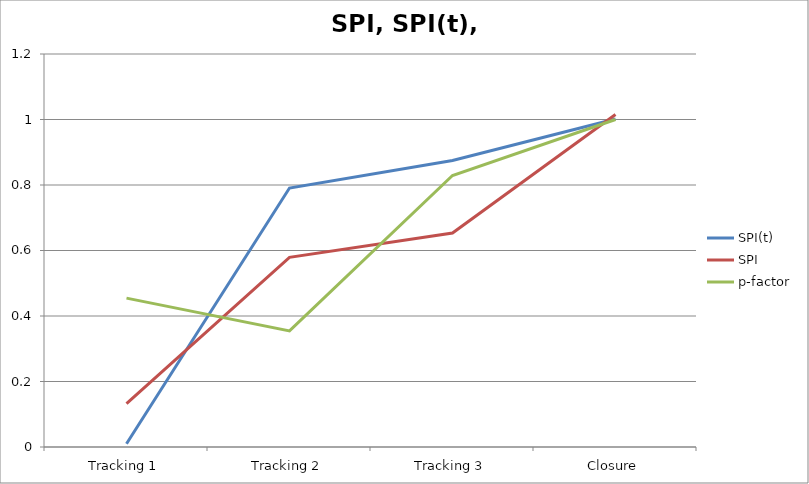
| Category | SPI(t) | SPI | p-factor |
|---|---|---|---|
| Tracking 1 | 0.01 | 0.132 | 0.455 |
| Tracking 2 | 0.791 | 0.579 | 0.355 |
| Tracking 3 | 0.875 | 0.653 | 0.829 |
| Closure | 1.002 | 1.015 | 1 |